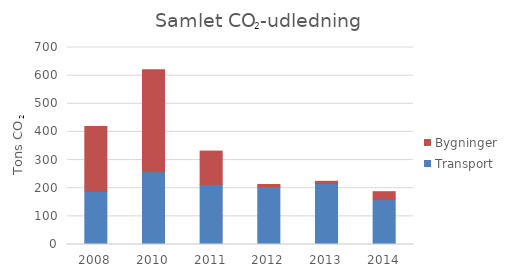
| Category | Transport | Bygninger |
|---|---|---|
| 2008.0 | 189.4 | 229.7 |
| 2010.0 | 258.2 | 362.4 |
| 2011.0 | 213.6 | 118.3 |
| 2012.0 | 205.7 | 7.5 |
| 2013.0 | 216.2 | 8.3 |
| 2014.0 | 159.41 | 28.259 |